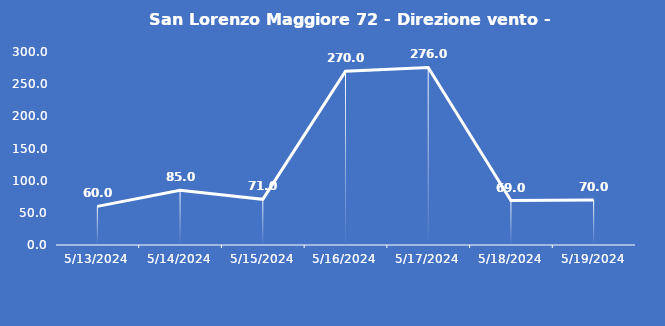
| Category | San Lorenzo Maggiore 72 - Direzione vento - Grezzo (°N) |
|---|---|
| 5/13/24 | 60 |
| 5/14/24 | 85 |
| 5/15/24 | 71 |
| 5/16/24 | 270 |
| 5/17/24 | 276 |
| 5/18/24 | 69 |
| 5/19/24 | 70 |